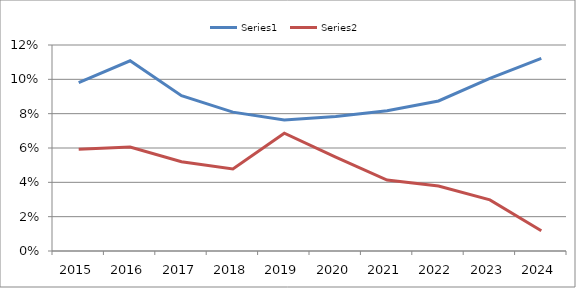
| Category | Series 0 | Series 1 |
|---|---|---|
| 2015.0 | 0.098 | 0.059 |
| 2016.0 | 0.111 | 0.061 |
| 2017.0 | 0.09 | 0.052 |
| 2018.0 | 0.081 | 0.048 |
| 2019.0 | 0.076 | 0.069 |
| 2020.0 | 0.078 | 0.055 |
| 2021.0 | 0.082 | 0.041 |
| 2022.0 | 0.087 | 0.038 |
| 2023.0 | 0.1 | 0.03 |
| 2024.0 | 0.112 | 0.012 |